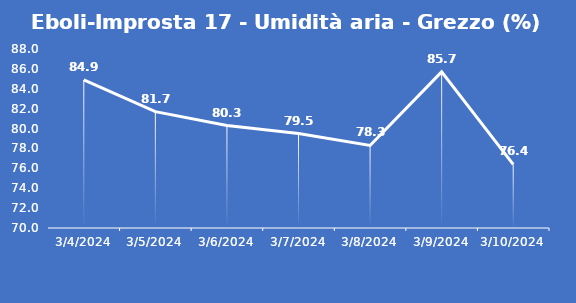
| Category | Eboli-Improsta 17 - Umidità aria - Grezzo (%) |
|---|---|
| 3/4/24 | 84.9 |
| 3/5/24 | 81.7 |
| 3/6/24 | 80.3 |
| 3/7/24 | 79.5 |
| 3/8/24 | 78.3 |
| 3/9/24 | 85.7 |
| 3/10/24 | 76.4 |